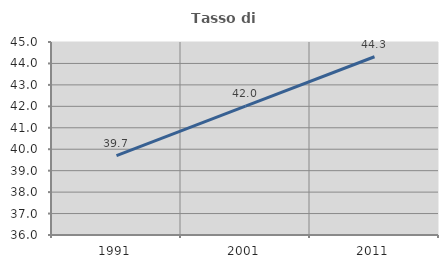
| Category | Tasso di occupazione   |
|---|---|
| 1991.0 | 39.698 |
| 2001.0 | 42.006 |
| 2011.0 | 44.312 |